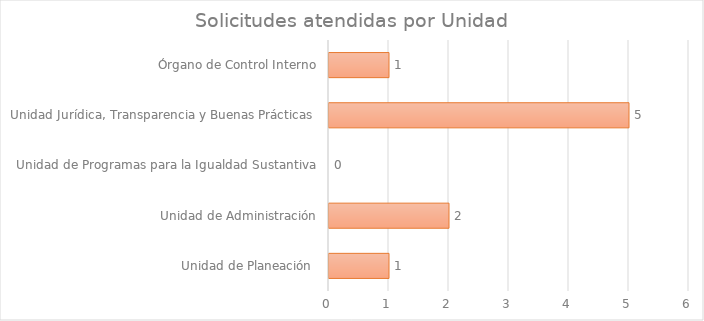
| Category | Series 1 |
|---|---|
| Unidad de Planeación  | 1 |
| Unidad de Administración | 2 |
| Unidad de Programas para la Igualdad Sustantiva | 0 |
| Unidad Jurídica, Transparencia y Buenas Prácticas  | 5 |
| Órgano de Control Interno | 1 |